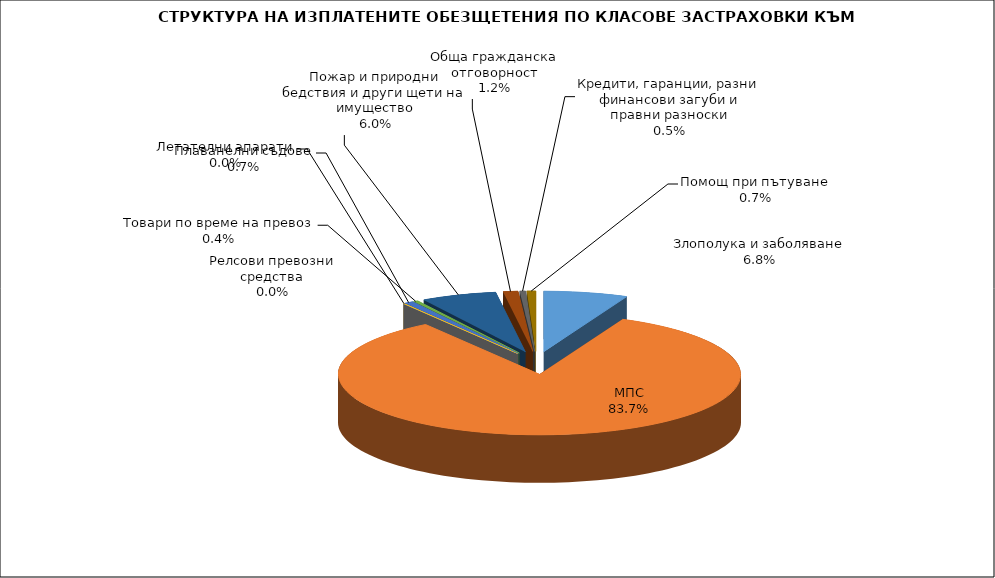
| Category | Злополука и заболяване МПС Релсови превозни средства Летателни апарати Плаванелни съдове Товари по време на превоз Пожар и природни бедствия и други щети на имущество Обща гражданска отговорност Кредити, гаранции, разни финансови загуби и правни разноски  |
|---|---|
| Злополука и заболяване | 0.068 |
| МПС | 0.837 |
| Релсови превозни средства | 0 |
| Летателни апарати | 0 |
| Плаванелни съдове | 0.007 |
| Товари по време на превоз | 0.004 |
| Пожар и природни бедствия и други щети на имущество | 0.06 |
| Обща гражданска отговорност | 0.012 |
| Кредити, гаранции, разни финансови загуби и правни разноски | 0.005 |
| Помощ при пътуване | 0.007 |